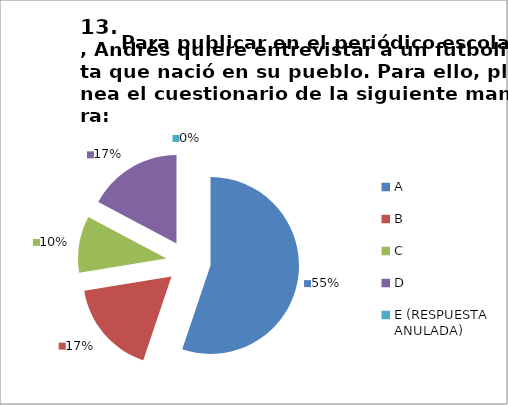
| Category | CANTIDAD DE RESPUESTAS PREGUNTA (13) | PORCENTAJE |
|---|---|---|
| A | 16 | 0.552 |
| B | 5 | 0.172 |
| C | 3 | 0.103 |
| D | 5 | 0.172 |
| E (RESPUESTA ANULADA) | 0 | 0 |